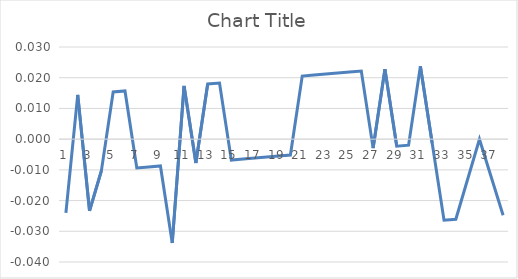
| Category | Series 0 |
|---|---|
| 0 | -0.024 |
| 1 | 0.014 |
| 2 | -0.023 |
| 3 | -0.01 |
| 4 | 0.015 |
| 5 | 0.016 |
| 6 | -0.009 |
| 7 | -0.009 |
| 8 | -0.009 |
| 9 | -0.034 |
| 10 | 0.017 |
| 11 | -0.008 |
| 12 | 0.018 |
| 13 | 0.018 |
| 14 | -0.007 |
| 15 | -0.006 |
| 16 | -0.006 |
| 17 | -0.006 |
| 18 | -0.006 |
| 19 | -0.005 |
| 20 | 0.021 |
| 21 | 0.021 |
| 22 | 0.021 |
| 23 | 0.022 |
| 24 | 0.022 |
| 25 | 0.022 |
| 26 | -0.003 |
| 27 | 0.023 |
| 28 | -0.002 |
| 29 | -0.002 |
| 30 | 0.024 |
| 31 | -0.001 |
| 32 | -0.026 |
| 33 | -0.026 |
| 34 | -0.013 |
| 35 | 0 |
| 36 | -0.012 |
| 37 | -0.025 |